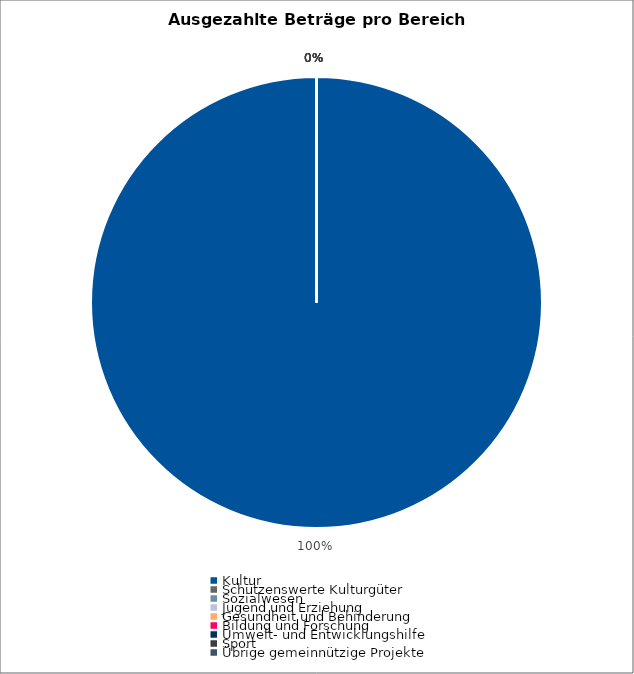
| Category | Series 0 |
|---|---|
| Kultur | 28406321.07 |
| Schützenswerte Kulturgüter | 0 |
| Sozialwesen | 0 |
| Jugend und Erziehung | 0 |
| Gesundheit und Behinderung | 0 |
| Bildung und Forschung | 0 |
| Umwelt- und Entwicklungshilfe | 0 |
| Sport | 0 |
| Übrige gemeinnützige Projekte | 0 |